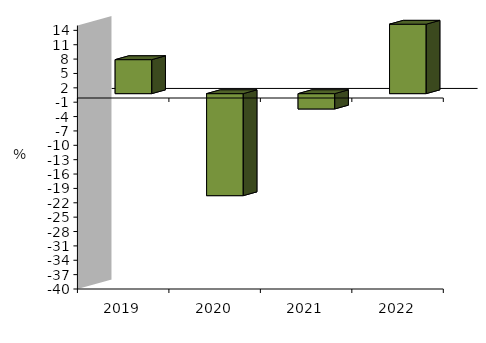
| Category | I.C.I |
|---|---|
| 2019-05-01 | 7.1 |
| 2020-05-01 | -21.3 |
| 2021-05-01 | -3.2 |
| 2022-05-01 | 14.5 |